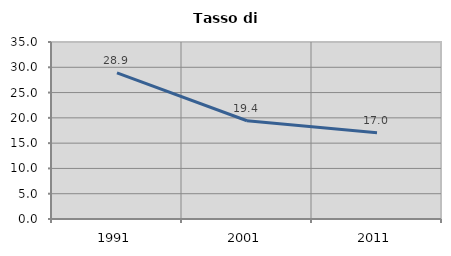
| Category | Tasso di disoccupazione   |
|---|---|
| 1991.0 | 28.889 |
| 2001.0 | 19.431 |
| 2011.0 | 17.044 |